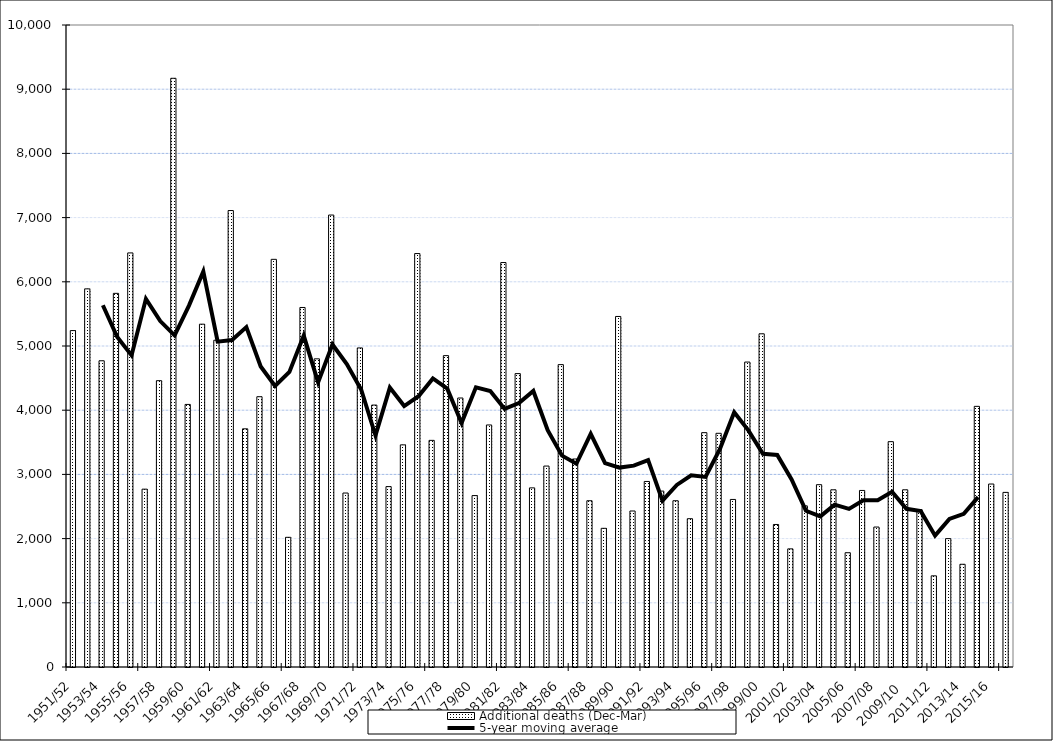
| Category | Additional deaths (Dec-Mar) |
|---|---|
| 1951/52 | 5240 |
| 1952/53 | 5890 |
| 1953/54 | 4770 |
| 1954/55 | 5820 |
| 1955/56 | 6450 |
| 1956/57 | 2770 |
| 1957/58 | 4460 |
| 1958/59 | 9170 |
| 1959/60 | 4090 |
| 1960/61 | 5340 |
| 1961/62 | 5090 |
| 1962/63 | 7110 |
| 1963/64 | 3710 |
| 1964/65 | 4210 |
| 1965/66 | 6350 |
| 1966/67 | 2020 |
| 1967/68 | 5600 |
| 1968/69 | 4800 |
| 1969/70 | 7040 |
| 1970/71 | 2710 |
| 1971/72 | 4970 |
| 1972/73 | 4080 |
| 1973/74 | 2810 |
| 1974/75 | 3460 |
| 1975/76 | 6440 |
| 1976/77 | 3530 |
| 1977/78 | 4850 |
| 1978/79 | 4190 |
| 1979/80 | 2670 |
| 1980/81 | 3770 |
| 1981/82 | 6300 |
| 1982/83 | 4570 |
| 1983/84 | 2790 |
| 1984/85 | 3130 |
| 1985/86 | 4710 |
| 1986/87 | 3240 |
| 1987/88 | 2590 |
| 1988/89 | 2160 |
| 1989/90 | 5460 |
| 1990/91 | 2430 |
| 1991/92 | 2890 |
| 1992/93 | 2740 |
| 1993/94 | 2590 |
| 1994/95 | 2310 |
| 1995/96 | 3650 |
| 1996/97 | 3640 |
| 1997/98 | 2610 |
| 1998/99 | 4750 |
| 1999/00 | 5190 |
| 2000/01 | 2220 |
| 2001/02 | 1840 |
| 2002/03 | 2510 |
| 2003/04 | 2840 |
| 2004/05 | 2760 |
| 2005/06 | 1780 |
| 2006/07 | 2750 |
| 2007/08 | 2180 |
| 2008/09 | 3510 |
| 2009/10  | 2760 |
| 2010/11 | 2450 |
| 2011/12 | 1420 |
| 2012/13 | 2000 |
| 2013/14 | 1600 |
| 2014/15 | 4060 |
| 2015/16 | 2850 |
| 2016/17 prov. | 2720 |